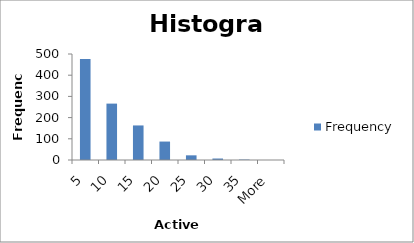
| Category | Frequency |
|---|---|
| 5 | 476 |
| 10 | 266 |
| 15 | 163 |
| 20 | 87 |
| 25 | 22 |
| 30 | 7 |
| 35 | 2 |
| More | 0 |